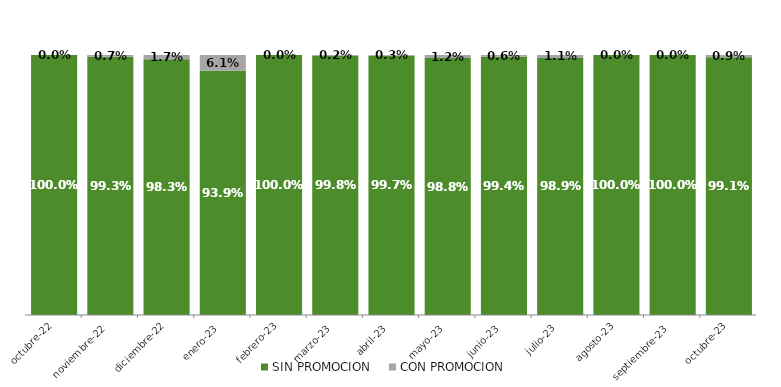
| Category | SIN PROMOCION   | CON PROMOCION   |
|---|---|---|
| 2022-10-01 | 1 | 0 |
| 2022-11-01 | 0.993 | 0.007 |
| 2022-12-01 | 0.983 | 0.017 |
| 2023-01-01 | 0.939 | 0.061 |
| 2023-02-01 | 1 | 0 |
| 2023-03-01 | 0.998 | 0.002 |
| 2023-04-01 | 0.997 | 0.003 |
| 2023-05-01 | 0.988 | 0.012 |
| 2023-06-01 | 0.994 | 0.006 |
| 2023-07-01 | 0.989 | 0.011 |
| 2023-08-01 | 1 | 0 |
| 2023-09-01 | 1 | 0 |
| 2023-10-01 | 0.991 | 0.009 |